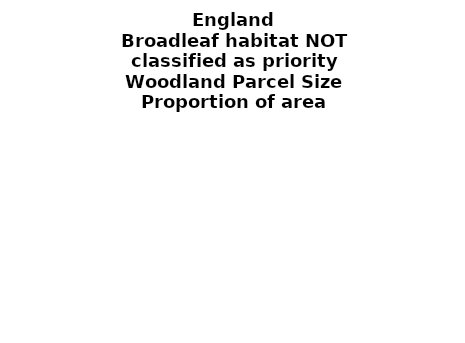
| Category | Broadleaf habitat NOT classified as priority |
|---|---|
| <5 ha | 0.274 |
| ≥5 and <10 ha | 0.094 |
| ≥10 and <15 ha | 0.052 |
| ≥15 and <20 ha | 0.024 |
| ≥20 and <25 ha | 0.025 |
| ≥25 and <30 ha | 0.036 |
| ≥30 and <35 ha | 0.013 |
| ≥35 and <40 ha | 0.019 |
| ≥40 and <45 ha | 0.005 |
| ≥45 and <50 ha | 0.01 |
| ≥50 and <60 ha | 0.028 |
| ≥60 and <70 ha | 0.036 |
| ≥70 and <80 ha | 0.03 |
| ≥80 and <90 ha | 0.033 |
| ≥90 and <100 ha | 0.024 |
| ≥100 and <150 ha | 0.096 |
| ≥150 and <200 ha | 0.055 |
| ≥200 ha | 0.146 |